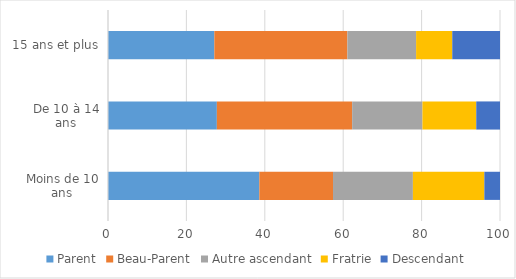
| Category | Parent | Beau-Parent | Autre ascendant | Fratrie | Descendant |
|---|---|---|---|---|---|
| Moins de 10 ans | 38.606 | 18.795 | 20.379 | 18.226 | 3.993 |
| De 10 à 14 ans | 27.772 | 34.514 | 17.929 | 13.727 | 6.058 |
| 15 ans et plus | 27.122 | 33.948 | 17.528 | 9.225 | 12.177 |